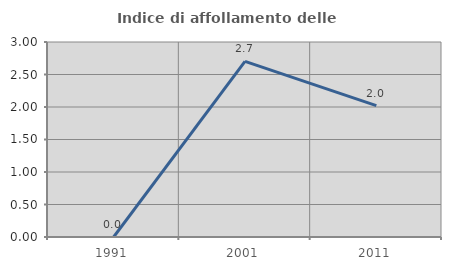
| Category | Indice di affollamento delle abitazioni  |
|---|---|
| 1991.0 | 0 |
| 2001.0 | 2.703 |
| 2011.0 | 2.02 |